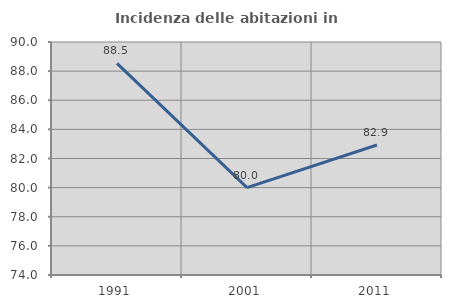
| Category | Incidenza delle abitazioni in proprietà  |
|---|---|
| 1991.0 | 88.535 |
| 2001.0 | 80 |
| 2011.0 | 82.927 |